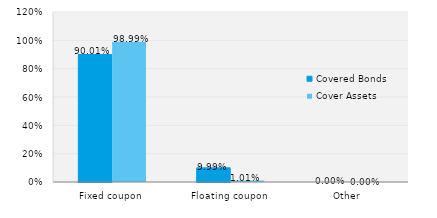
| Category | Covered Bonds | Cover Assets |
|---|---|---|
| Fixed coupon | 0.9 | 0.99 |
| Floating coupon | 0.1 | 0.01 |
| Other | 0 | 0 |